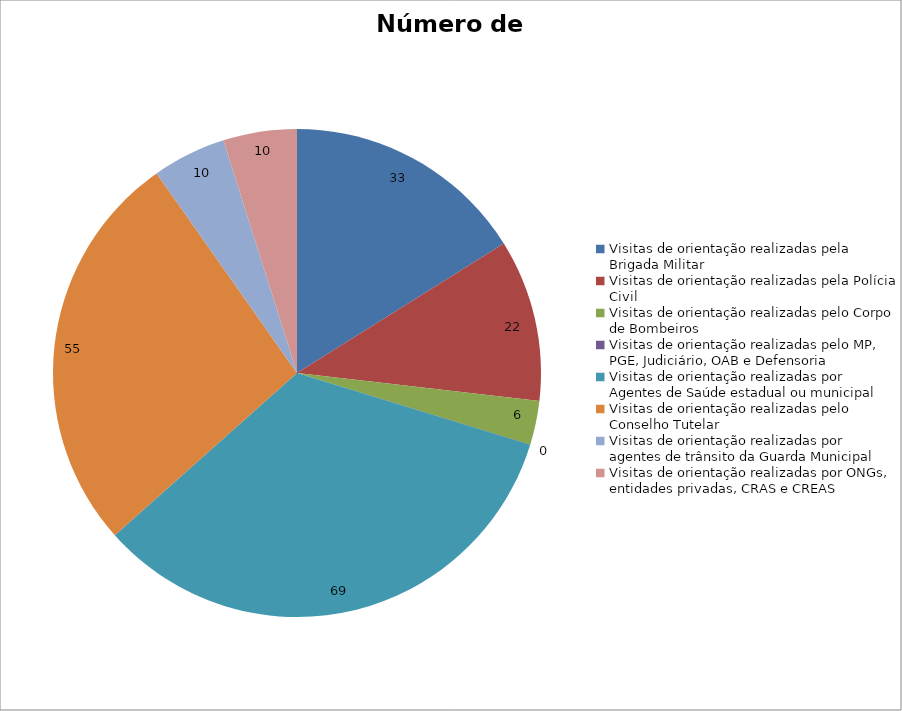
| Category | Número de Ações |
|---|---|
| Visitas de orientação realizadas pela Brigada Militar | 33 |
| Visitas de orientação realizadas pela Polícia Civil | 22 |
| Visitas de orientação realizadas pelo Corpo de Bombeiros | 6 |
| Visitas de orientação realizadas pelo MP, PGE, Judiciário, OAB e Defensoria | 0 |
| Visitas de orientação realizadas por Agentes de Saúde estadual ou municipal | 69 |
| Visitas de orientação realizadas pelo Conselho Tutelar | 55 |
| Visitas de orientação realizadas por agentes de trânsito da Guarda Municipal | 10 |
| Visitas de orientação realizadas por ONGs, entidades privadas, CRAS e CREAS | 10 |